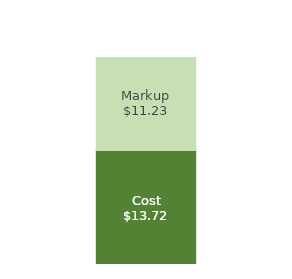
| Category | Cost | Markup |
|---|---|---|
| 0 | 13.72 | 11.23 |